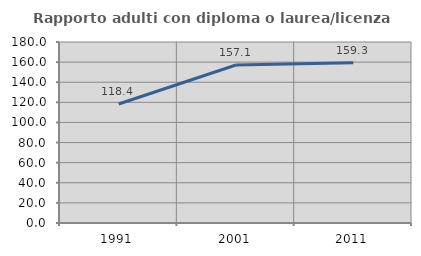
| Category | Rapporto adulti con diploma o laurea/licenza media  |
|---|---|
| 1991.0 | 118.367 |
| 2001.0 | 157.143 |
| 2011.0 | 159.292 |